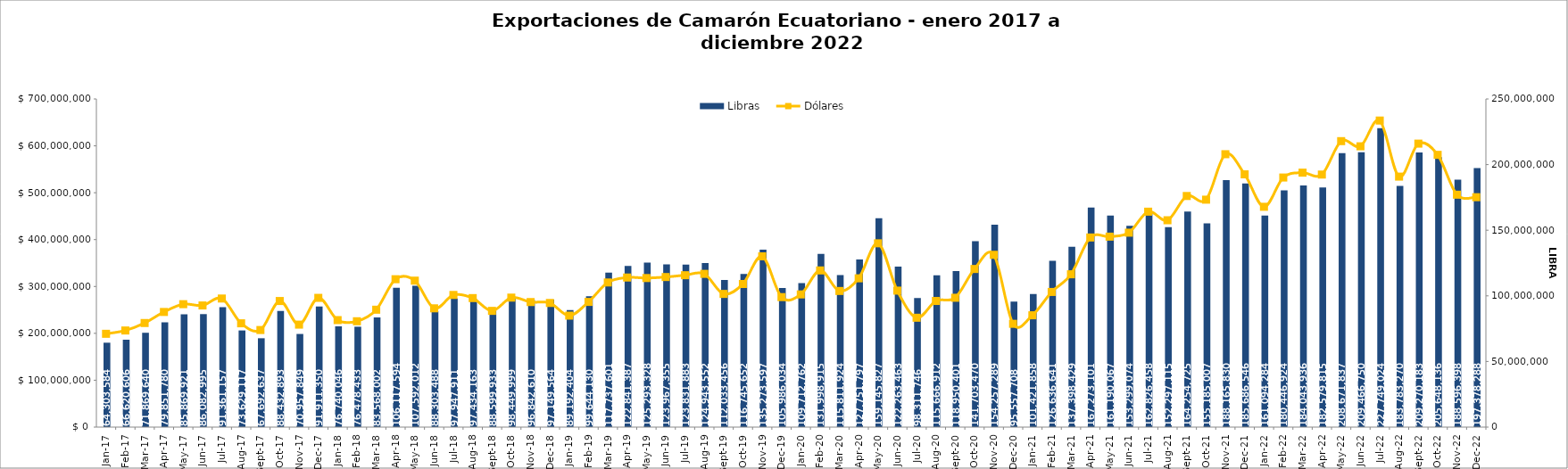
| Category | Libras  |
|---|---|
| 2017-01-01 | 64303584 |
| 2017-02-01 | 66620606 |
| 2017-03-01 | 71869640 |
| 2017-04-01 | 79851780 |
| 2017-05-01 | 85869921 |
| 2017-06-01 | 86082995 |
| 2017-07-01 | 91361157 |
| 2017-08-01 | 73629117 |
| 2017-09-01 | 67692637 |
| 2017-10-01 | 88432893 |
| 2017-11-01 | 70957849 |
| 2017-12-01 | 91911350 |
| 2018-01-01 | 76740046 |
| 2018-02-01 | 76478433 |
| 2018-03-01 | 83568002 |
| 2018-04-01 | 106117594 |
| 2018-05-01 | 107592012 |
| 2018-06-01 | 88303488 |
| 2018-07-01 | 97947911 |
| 2018-08-01 | 97434163 |
| 2018-09-01 | 88599933 |
| 2018-10-01 | 98449999 |
| 2018-11-01 | 96842610 |
| 2018-12-01 | 97149564 |
| 2019-01-01 | 89192404 |
| 2019-02-01 | 99644130 |
| 2019-03-01 | 117737601 |
| 2019-04-01 | 122841387 |
| 2019-05-01 | 125293328 |
| 2019-06-01 | 123967355 |
| 2019-07-01 | 123831883 |
| 2019-08-01 | 124943552 |
| 2019-09-01 | 112033456 |
| 2019-10-01 | 116745652 |
| 2019-11-01 | 135273597 |
| 2019-12-01 | 105986034 |
| 2020-01-01 | 109712762 |
| 2020-02-01 | 131998915 |
| 2020-03-01 | 115811924 |
| 2020-04-01 | 127751797 |
| 2020-05-01 | 159145827 |
| 2020-06-01 | 122263463 |
| 2020-07-01 | 98311746 |
| 2020-08-01 | 115666912 |
| 2020-09-01 | 118950401 |
| 2020-10-01 | 141703470 |
| 2020-11-01 | 154257289 |
| 2020-12-01 | 95557708 |
| 2021-01-01 | 101421858 |
| 2021-02-01 | 126636641 |
| 2021-03-01 | 137398429 |
| 2021-04-01 | 167273101 |
| 2021-05-01 | 161190067 |
| 2021-06-01 | 153299074 |
| 2021-07-01 | 162826458 |
| 2021-08-01 | 152297115 |
| 2021-09-01 | 164254725 |
| 2021-10-01 | 155185007 |
| 2021-11-01 | 188165830 |
| 2021-12-01 | 185686546 |
| 2022-01-01 | 161094284 |
| 2022-02-01 | 180446924 |
| 2022-03-01 | 184043936 |
| 2022-04-01 | 182579815 |
| 2022-05-01 | 208671837 |
| 2022-06-01 | 209466750 |
| 2022-07-01 | 227749024 |
| 2022-08-01 | 183783270 |
| 2022-09-01 | 209270183 |
| 2022-10-01 | 205648136 |
| 2022-11-01 | 188596398 |
| 2022-12-01 | 197378288 |